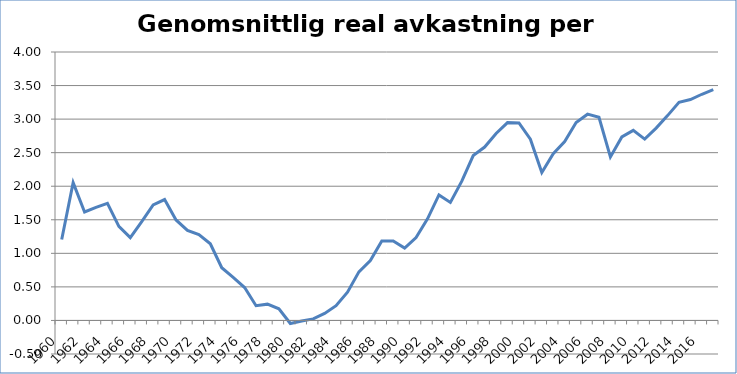
| Category | Genomsnittlig real  |
|---|---|
| 1960.0 | 1.207 |
| 1961.0 | 2.054 |
| 1962.0 | 1.616 |
| 1963.0 | 1.686 |
| 1964.0 | 1.746 |
| 1965.0 | 1.401 |
| 1966.0 | 1.234 |
| 1967.0 | 1.471 |
| 1968.0 | 1.721 |
| 1969.0 | 1.802 |
| 1970.0 | 1.498 |
| 1971.0 | 1.341 |
| 1972.0 | 1.278 |
| 1973.0 | 1.143 |
| 1974.0 | 0.785 |
| 1975.0 | 0.641 |
| 1976.0 | 0.49 |
| 1977.0 | 0.22 |
| 1978.0 | 0.243 |
| 1979.0 | 0.173 |
| 1980.0 | -0.046 |
| 1981.0 | -0.01 |
| 1982.0 | 0.024 |
| 1983.0 | 0.105 |
| 1984.0 | 0.219 |
| 1985.0 | 0.422 |
| 1986.0 | 0.724 |
| 1987.0 | 0.893 |
| 1988.0 | 1.183 |
| 1989.0 | 1.183 |
| 1990.0 | 1.079 |
| 1991.0 | 1.236 |
| 1992.0 | 1.514 |
| 1993.0 | 1.87 |
| 1994.0 | 1.759 |
| 1995.0 | 2.075 |
| 1996.0 | 2.457 |
| 1997.0 | 2.583 |
| 1998.0 | 2.787 |
| 1999.0 | 2.948 |
| 2000.0 | 2.944 |
| 2001.0 | 2.701 |
| 2002.0 | 2.205 |
| 2003.0 | 2.484 |
| 2004.0 | 2.665 |
| 2005.0 | 2.949 |
| 2006.0 | 3.074 |
| 2007.0 | 3.027 |
| 2008.0 | 2.437 |
| 2009.0 | 2.735 |
| 2010.0 | 2.832 |
| 2011.0 | 2.702 |
| 2012.0 | 2.866 |
| 2013.0 | 3.052 |
| 2014.0 | 3.25 |
| 2015.0 | 3.292 |
| 2016.0 | 3.37 |
| 2017.0 | 3.438 |